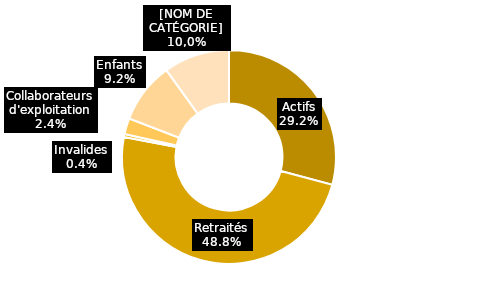
| Category | Tranches âge |
|---|---|
| Actifs | 0.292 |
| Retraités | 0.488 |
| Invalides | 0.004 |
| Collaborateurs d'exploitation | 0.024 |
| Enfants | 0.092 |
| Autres personnes couvertes | 0.099 |